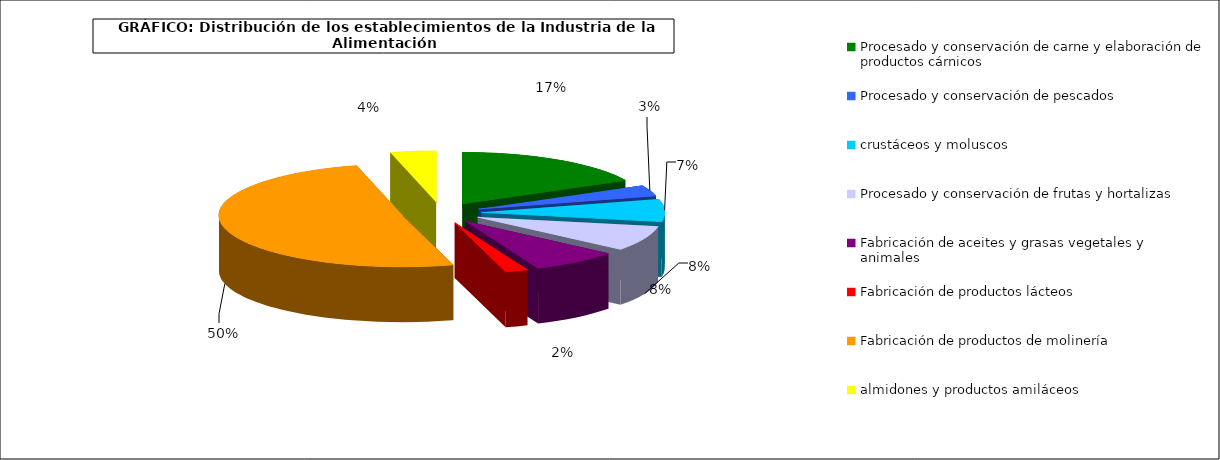
| Category | Procesado y conservación de carne y elaboración de productos cárnicos |
|---|---|
| 0 | 4550 |
| 1 | 885 |
| 2 | 1843 |
| 3 | 2056 |
| 4 | 2015 |
| 5 | 522 |
| 6 | 13157 |
| 7 | 1047 |